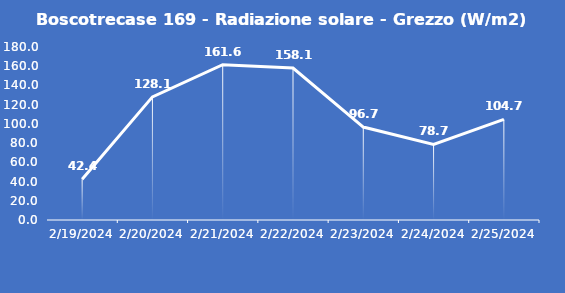
| Category | Boscotrecase 169 - Radiazione solare - Grezzo (W/m2) |
|---|---|
| 2/19/24 | 42.4 |
| 2/20/24 | 128.1 |
| 2/21/24 | 161.6 |
| 2/22/24 | 158.1 |
| 2/23/24 | 96.7 |
| 2/24/24 | 78.7 |
| 2/25/24 | 104.7 |